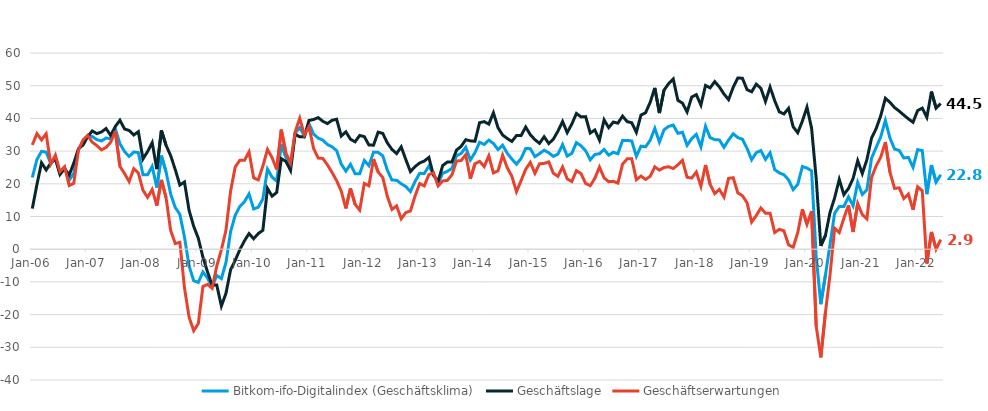
| Category | Bitkom-ifo-Digitalindex (Geschäftsklima) | Geschäftslage | Geschäftserwartungen |
|---|---|---|---|
| 2006-01-01 | 21.937 | 12.416 | 31.885 |
| 2006-02-01 | 27.405 | 19.733 | 35.344 |
| 2006-03-01 | 29.913 | 26.447 | 33.433 |
| 2006-04-01 | 29.707 | 24.244 | 35.302 |
| 2006-05-01 | 26.185 | 26.333 | 26.038 |
| 2006-06-01 | 28.179 | 27.598 | 28.761 |
| 2006-07-01 | 23.289 | 22.837 | 23.742 |
| 2006-08-01 | 24.939 | 24.657 | 25.221 |
| 2006-09-01 | 21.076 | 22.698 | 19.465 |
| 2006-10-01 | 23.229 | 26.35 | 20.151 |
| 2006-11-01 | 30.516 | 30.688 | 30.345 |
| 2006-12-01 | 32.632 | 31.849 | 33.419 |
| 2007-01-01 | 34.606 | 34.41 | 34.801 |
| 2007-02-01 | 34.439 | 36.162 | 32.728 |
| 2007-03-01 | 33.494 | 35.337 | 31.665 |
| 2007-04-01 | 33.103 | 35.861 | 30.378 |
| 2007-05-01 | 33.996 | 36.902 | 31.125 |
| 2007-06-01 | 33.729 | 34.762 | 32.7 |
| 2007-07-01 | 36.827 | 37.543 | 36.113 |
| 2007-08-01 | 32.27 | 39.435 | 25.318 |
| 2007-09-01 | 29.863 | 36.772 | 23.157 |
| 2007-10-01 | 28.355 | 36.294 | 20.683 |
| 2007-11-01 | 29.712 | 34.918 | 24.622 |
| 2007-12-01 | 29.543 | 35.94 | 23.32 |
| 2008-01-01 | 22.754 | 27.595 | 18.016 |
| 2008-02-01 | 22.743 | 29.856 | 15.85 |
| 2008-03-01 | 25.318 | 32.593 | 18.27 |
| 2008-04-01 | 18.845 | 24.492 | 13.339 |
| 2008-05-01 | 28.621 | 36.304 | 21.188 |
| 2008-06-01 | 23.659 | 31.814 | 15.791 |
| 2008-07-01 | 16.883 | 28.617 | 5.751 |
| 2008-08-01 | 12.748 | 24.369 | 1.729 |
| 2008-09-01 | 10.672 | 19.609 | 2.099 |
| 2008-10-01 | 3.712 | 20.549 | -11.839 |
| 2008-11-01 | -5.133 | 11.876 | -20.776 |
| 2008-12-01 | -9.637 | 6.992 | -24.93 |
| 2009-01-01 | -10.148 | 3.345 | -22.745 |
| 2009-02-01 | -6.963 | -2.432 | -11.389 |
| 2009-03-01 | -8.873 | -6.94 | -10.786 |
| 2009-04-01 | -11.499 | -11.049 | -11.947 |
| 2009-05-01 | -8.052 | -10.935 | -5.125 |
| 2009-06-01 | -8.998 | -17.393 | -0.217 |
| 2009-07-01 | -4.067 | -13.49 | 5.832 |
| 2009-08-01 | 5.375 | -6.292 | 17.746 |
| 2009-09-01 | 10.38 | -3.41 | 25.137 |
| 2009-10-01 | 13.071 | -0.173 | 27.194 |
| 2009-11-01 | 14.51 | 2.56 | 27.165 |
| 2009-12-01 | 16.909 | 4.779 | 29.758 |
| 2010-01-01 | 12.305 | 3.2 | 21.818 |
| 2010-02-01 | 12.822 | 4.772 | 21.188 |
| 2010-03-01 | 15.374 | 5.792 | 25.403 |
| 2010-04-01 | 24.486 | 18.601 | 30.53 |
| 2010-05-01 | 22.025 | 16.216 | 27.991 |
| 2010-06-01 | 20.84 | 17.358 | 24.378 |
| 2010-07-01 | 32.08 | 27.694 | 36.55 |
| 2010-08-01 | 28.133 | 26.852 | 29.421 |
| 2010-09-01 | 25.206 | 24.065 | 26.353 |
| 2010-10-01 | 35.524 | 35.193 | 35.856 |
| 2010-11-01 | 37.187 | 34.36 | 40.048 |
| 2010-12-01 | 34.639 | 34.354 | 34.924 |
| 2011-01-01 | 38.417 | 39.368 | 37.47 |
| 2011-02-01 | 35.201 | 39.67 | 30.814 |
| 2011-03-01 | 33.968 | 40.235 | 27.864 |
| 2011-04-01 | 33.372 | 39.122 | 27.76 |
| 2011-05-01 | 32.021 | 38.41 | 25.804 |
| 2011-06-01 | 31.314 | 39.415 | 23.487 |
| 2011-07-01 | 30.146 | 39.746 | 20.931 |
| 2011-08-01 | 26.028 | 34.598 | 17.77 |
| 2011-09-01 | 23.88 | 35.903 | 12.469 |
| 2011-10-01 | 25.995 | 33.627 | 18.612 |
| 2011-11-01 | 23.085 | 32.851 | 13.729 |
| 2011-12-01 | 23.078 | 34.78 | 11.959 |
| 2012-01-01 | 27.152 | 34.43 | 20.101 |
| 2012-02-01 | 25.542 | 31.857 | 19.399 |
| 2012-03-01 | 29.684 | 31.812 | 27.577 |
| 2012-04-01 | 29.61 | 35.798 | 23.585 |
| 2012-05-01 | 28.574 | 35.412 | 21.935 |
| 2012-06-01 | 24.158 | 32.492 | 16.122 |
| 2012-07-01 | 21.14 | 30.509 | 12.152 |
| 2012-08-01 | 21.104 | 29.251 | 13.247 |
| 2012-09-01 | 20.014 | 31.293 | 9.285 |
| 2012-10-01 | 19.156 | 27.417 | 11.194 |
| 2012-11-01 | 17.632 | 23.727 | 11.703 |
| 2012-12-01 | 20.697 | 25.252 | 16.234 |
| 2013-01-01 | 23.205 | 26.374 | 20.08 |
| 2013-02-01 | 23.122 | 26.949 | 19.359 |
| 2013-03-01 | 25.421 | 28.061 | 22.81 |
| 2013-04-01 | 22.986 | 22.596 | 23.376 |
| 2013-05-01 | 20.066 | 20.774 | 19.36 |
| 2013-06-01 | 23.213 | 25.584 | 20.867 |
| 2013-07-01 | 23.817 | 26.641 | 21.028 |
| 2013-08-01 | 24.714 | 26.691 | 22.755 |
| 2013-09-01 | 28.624 | 30.313 | 26.947 |
| 2013-10-01 | 29.27 | 31.443 | 27.118 |
| 2013-11-01 | 31.183 | 33.485 | 28.903 |
| 2013-12-01 | 27.261 | 33.13 | 21.539 |
| 2014-01-01 | 29.545 | 33.007 | 26.134 |
| 2014-02-01 | 32.7 | 38.688 | 26.862 |
| 2014-03-01 | 32.031 | 39.012 | 25.253 |
| 2014-04-01 | 33.352 | 38.244 | 28.56 |
| 2014-05-01 | 32.342 | 41.715 | 23.333 |
| 2014-06-01 | 30.466 | 37.144 | 23.975 |
| 2014-07-01 | 31.807 | 34.91 | 28.746 |
| 2014-08-01 | 29.328 | 33.852 | 24.891 |
| 2014-09-01 | 27.564 | 32.952 | 22.3 |
| 2014-10-01 | 25.999 | 34.741 | 17.582 |
| 2014-11-01 | 27.75 | 34.751 | 20.958 |
| 2014-12-01 | 30.81 | 37.354 | 24.447 |
| 2015-01-01 | 30.739 | 35.015 | 26.542 |
| 2015-02-01 | 28.304 | 33.501 | 23.223 |
| 2015-03-01 | 29.223 | 32.366 | 26.123 |
| 2015-04-01 | 30.279 | 34.387 | 26.243 |
| 2015-05-01 | 29.488 | 32.308 | 26.703 |
| 2015-06-01 | 28.38 | 33.653 | 23.226 |
| 2015-07-01 | 29.098 | 36.118 | 22.287 |
| 2015-08-01 | 31.997 | 39.049 | 25.153 |
| 2015-09-01 | 28.487 | 35.654 | 21.538 |
| 2015-10-01 | 29.299 | 38.253 | 20.683 |
| 2015-11-01 | 32.608 | 41.518 | 24.026 |
| 2015-12-01 | 31.622 | 40.452 | 23.115 |
| 2016-01-01 | 30.092 | 40.534 | 20.104 |
| 2016-02-01 | 27.338 | 35.528 | 19.434 |
| 2016-03-01 | 28.96 | 36.457 | 21.701 |
| 2016-04-01 | 29.206 | 33.352 | 25.134 |
| 2016-05-01 | 30.515 | 39.549 | 21.822 |
| 2016-06-01 | 28.765 | 37.175 | 20.654 |
| 2016-07-01 | 29.637 | 38.879 | 20.753 |
| 2016-08-01 | 29.201 | 38.55 | 20.218 |
| 2016-09-01 | 33.238 | 40.699 | 26.008 |
| 2016-10-01 | 33.254 | 39.024 | 27.624 |
| 2016-11-01 | 33.094 | 38.679 | 27.639 |
| 2016-12-01 | 28.381 | 35.739 | 21.252 |
| 2017-01-01 | 31.507 | 41.018 | 22.372 |
| 2017-02-01 | 31.304 | 41.734 | 21.325 |
| 2017-03-01 | 33.334 | 44.918 | 22.298 |
| 2017-04-01 | 36.947 | 49.328 | 25.181 |
| 2017-05-01 | 32.743 | 41.631 | 24.182 |
| 2017-06-01 | 36.524 | 48.643 | 24.996 |
| 2017-07-01 | 37.578 | 50.637 | 25.2 |
| 2017-08-01 | 37.96 | 52.053 | 24.654 |
| 2017-09-01 | 35.456 | 45.523 | 25.801 |
| 2017-10-01 | 35.761 | 44.679 | 27.168 |
| 2017-11-01 | 31.77 | 41.971 | 21.999 |
| 2017-12-01 | 33.808 | 46.519 | 21.753 |
| 2018-01-01 | 35.13 | 47.264 | 23.591 |
| 2018-02-01 | 31.308 | 44.072 | 19.211 |
| 2018-03-01 | 37.601 | 50.079 | 25.746 |
| 2018-04-01 | 34.108 | 49.341 | 19.806 |
| 2018-05-01 | 33.509 | 51.262 | 17.01 |
| 2018-06-01 | 33.416 | 49.605 | 18.277 |
| 2018-07-01 | 31.163 | 47.464 | 15.935 |
| 2018-08-01 | 33.38 | 45.741 | 21.642 |
| 2018-09-01 | 35.282 | 49.508 | 21.866 |
| 2018-10-01 | 34.134 | 52.352 | 17.231 |
| 2018-11-01 | 33.633 | 52.289 | 16.358 |
| 2018-12-01 | 30.865 | 48.804 | 14.219 |
| 2019-01-01 | 27.344 | 48.131 | 8.299 |
| 2019-02-01 | 29.51 | 50.466 | 10.307 |
| 2019-03-01 | 30.179 | 49.217 | 12.595 |
| 2019-04-01 | 27.452 | 45.169 | 11.016 |
| 2019-05-01 | 29.482 | 49.589 | 10.994 |
| 2019-06-01 | 24.346 | 45.408 | 5.091 |
| 2019-07-01 | 23.33 | 42.015 | 6.088 |
| 2019-08-01 | 22.77 | 41.363 | 5.61 |
| 2019-09-01 | 21.229 | 43.073 | 1.348 |
| 2019-10-01 | 18.219 | 37.441 | 0.553 |
| 2019-11-01 | 19.831 | 35.616 | 5.104 |
| 2019-12-01 | 25.29 | 39.171 | 12.214 |
| 2020-01-01 | 24.811 | 43.427 | 7.618 |
| 2020-02-01 | 23.964 | 36.999 | 11.645 |
| 2020-03-01 | -2.25 | 21.627 | -23.555 |
| 2020-04-01 | -16.82 | 1.026 | -33.082 |
| 2020-05-01 | -7.953 | 4.2 | -19.382 |
| 2020-06-01 | 1.458 | 11.234 | -7.866 |
| 2020-07-01 | 11.01 | 15.705 | 6.417 |
| 2020-08-01 | 13.051 | 21.342 | 5.071 |
| 2020-09-01 | 13.033 | 16.68 | 9.448 |
| 2020-10-01 | 16.003 | 18.571 | 13.464 |
| 2020-11-01 | 13.282 | 21.617 | 5.262 |
| 2020-12-01 | 20.43 | 27.068 | 13.986 |
| 2021-01-01 | 16.745 | 23.126 | 10.546 |
| 2021-02-01 | 18.153 | 27.425 | 9.26 |
| 2021-03-01 | 27.83 | 33.952 | 21.869 |
| 2021-04-01 | 31.122 | 36.865 | 25.518 |
| 2021-05-01 | 34.385 | 40.822 | 28.12 |
| 2021-06-01 | 39.365 | 46.156 | 32.762 |
| 2021-07-01 | 33.961 | 44.916 | 23.497 |
| 2021-08-01 | 30.62 | 43.307 | 18.595 |
| 2021-09-01 | 30.197 | 42.228 | 18.763 |
| 2021-10-01 | 27.902 | 41.013 | 15.505 |
| 2021-11-01 | 28.059 | 39.848 | 16.85 |
| 2021-12-01 | 25.041 | 38.823 | 12.053 |
| 2022-01-01 | 30.446 | 42.391 | 19.089 |
| 2022-02-01 | 30.157 | 43.14 | 17.868 |
| 2022-03-01 | 16.831 | 40.346 | -4.384 |
| 2022-04-01 | 25.722 | 48.206 | 5.275 |
| 2022-05-01 | 20.507 | 43.138 | -0.017 |
| 2022-06-01 | 22.765 | 44.53 | 2.937 |